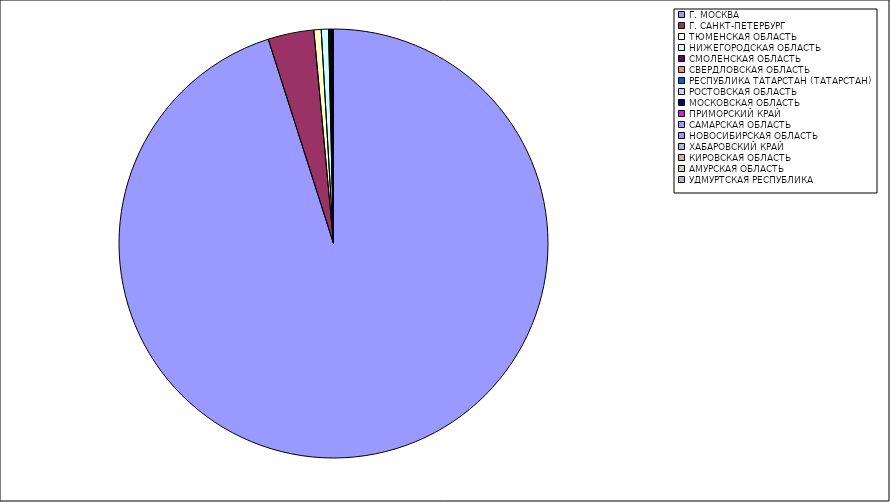
| Category | Оборот |
|---|---|
| Г. МОСКВА | 95.026 |
| Г. САНКТ-ПЕТЕРБУРГ | 3.454 |
| ТЮМЕНСКАЯ ОБЛАСТЬ | 0.551 |
| НИЖЕГОРОДСКАЯ ОБЛАСТЬ | 0.544 |
| СМОЛЕНСКАЯ ОБЛАСТЬ | 0.083 |
| СВЕРДЛОВСКАЯ ОБЛАСТЬ | 0.079 |
| РЕСПУБЛИКА ТАТАРСТАН (ТАТАРСТАН) | 0.068 |
| РОСТОВСКАЯ ОБЛАСТЬ | 0.029 |
| МОСКОВСКАЯ ОБЛАСТЬ | 0.027 |
| ПРИМОРСКИЙ КРАЙ | 0.023 |
| САМАРСКАЯ ОБЛАСТЬ | 0.019 |
| НОВОСИБИРСКАЯ ОБЛАСТЬ | 0.017 |
| ХАБАРОВСКИЙ КРАЙ | 0.008 |
| КИРОВСКАЯ ОБЛАСТЬ | 0.005 |
| АМУРСКАЯ ОБЛАСТЬ | 0.005 |
| УДМУРТСКАЯ РЕСПУБЛИКА | 0.005 |